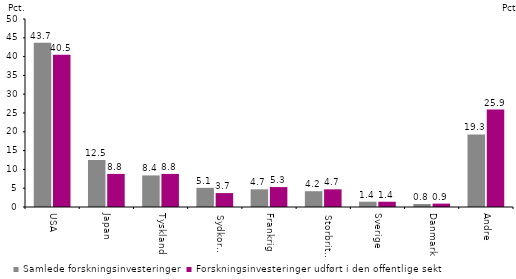
| Category | Samlede forskningsinvesteringer | Forskningsinvesteringer udført i den offentlige sektor |
|---|---|---|
| USA | 43.7 | 40.5 |
| Japan | 12.5 | 8.8 |
| Tyskland | 8.4 | 8.8 |
| Sydkorea | 5.1 | 3.7 |
| Frankrig | 4.7 | 5.3 |
| Storbritannien | 4.2 | 4.7 |
| Sverige | 1.4 | 1.4 |
| Danmark | 0.8 | 0.9 |
| Andre | 19.3 | 25.9 |